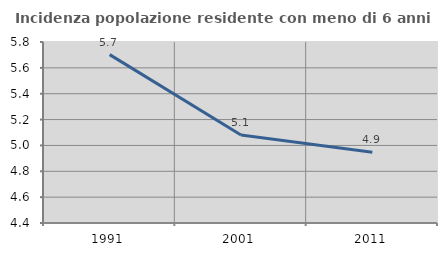
| Category | Incidenza popolazione residente con meno di 6 anni |
|---|---|
| 1991.0 | 5.702 |
| 2001.0 | 5.081 |
| 2011.0 | 4.947 |